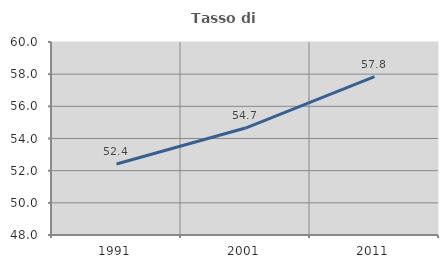
| Category | Tasso di occupazione   |
|---|---|
| 1991.0 | 52.414 |
| 2001.0 | 54.651 |
| 2011.0 | 57.843 |